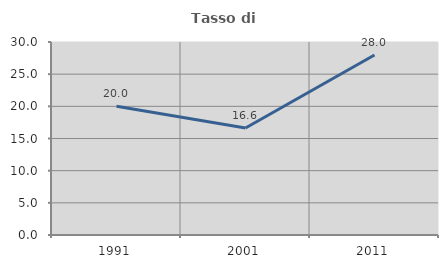
| Category | Tasso di occupazione   |
|---|---|
| 1991.0 | 20 |
| 2001.0 | 16.634 |
| 2011.0 | 27.975 |